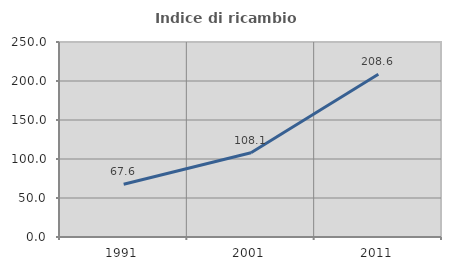
| Category | Indice di ricambio occupazionale  |
|---|---|
| 1991.0 | 67.596 |
| 2001.0 | 108.081 |
| 2011.0 | 208.633 |